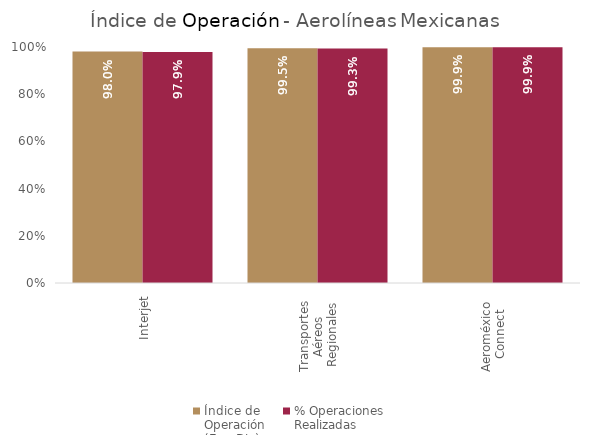
| Category | Índice de 
Operación
(Ene-Dic) | % Operaciones
Realizadas |
|---|---|---|
| Interjet | 0.98 | 0.979 |
| Transportes 
Aéreos 
Regionales | 0.995 | 0.993 |
| Aeroméxico 
Connect | 0.999 | 0.999 |